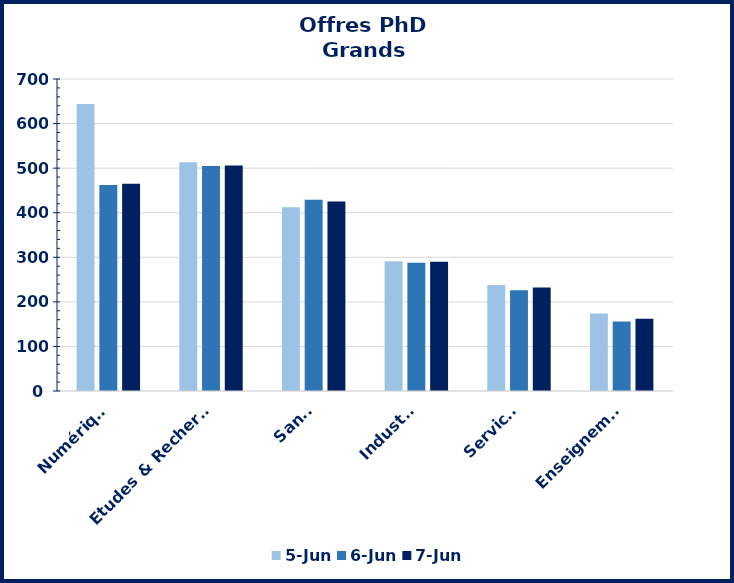
| Category | 05-juin | 06-juin | 07-juin |
|---|---|---|---|
| ​Numérique | 644 | 462 | 465 |
| Etudes & Recherche | 513 | 505 | 506 |
| Santé | 412 | 429 | 425 |
| Industrie | 291 | 288 | 290 |
| Services | 238 | 226 | 232 |
| Enseignement | 174 | 156 | 162 |